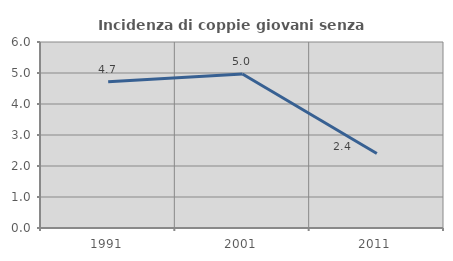
| Category | Incidenza di coppie giovani senza figli |
|---|---|
| 1991.0 | 4.715 |
| 2001.0 | 4.966 |
| 2011.0 | 2.403 |